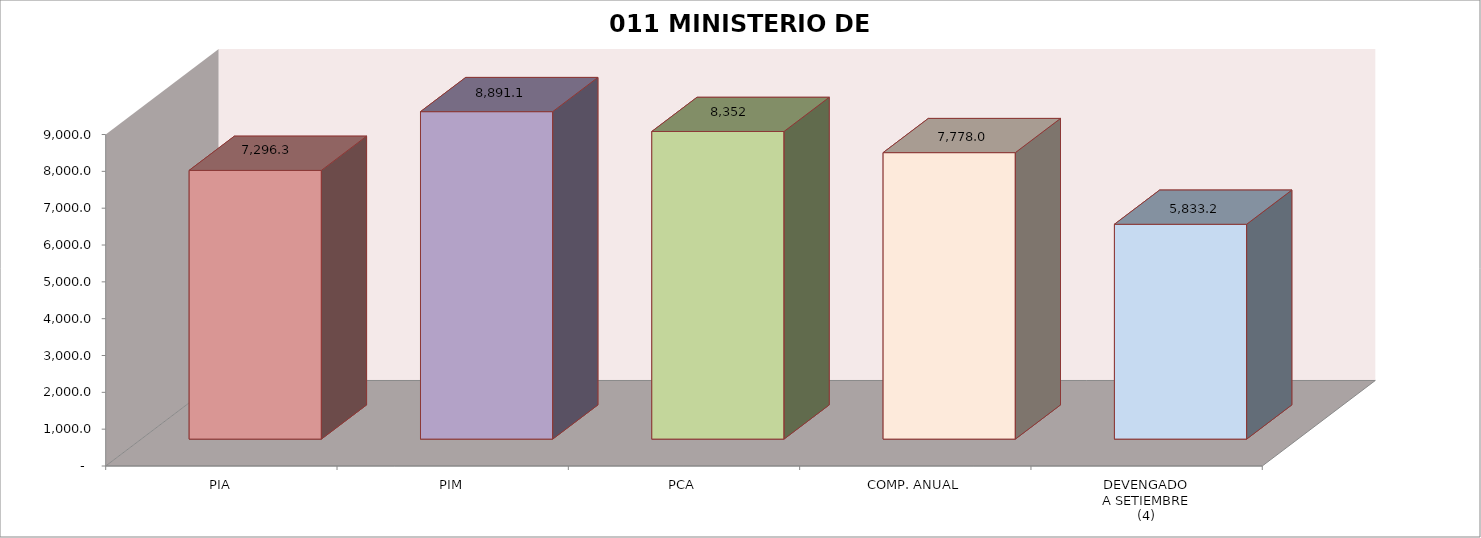
| Category | 011 MINISTERIO DE SALUD |
|---|---|
| PIA | 7296.309 |
| PIM | 8891.131 |
| PCA | 8352.43 |
| COMP. ANUAL | 7778.033 |
| DEVENGADO
A SETIEMBRE
(4) | 5833.183 |